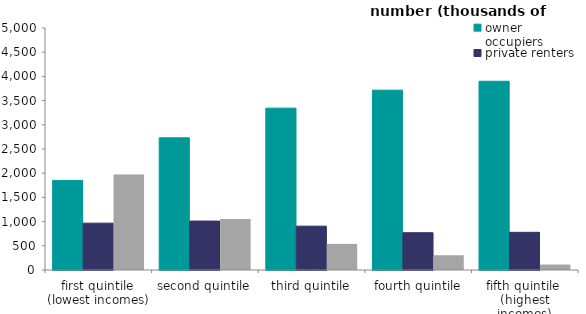
| Category | owner occupiers | private renters | social renters |
|---|---|---|---|
| first quintile 
(lowest incomes) | 1850.222 | 967.53 | 1973.247 |
| second quintile | 2730.518 | 1011.023 | 1054.173 |
| third quintile | 3343.975 | 906.091 | 539.636 |
| fourth quintile | 3715.69 | 770.583 | 304.576 |
| fifth quintile 
(highest incomes) | 3900.026 | 778.409 | 112.709 |